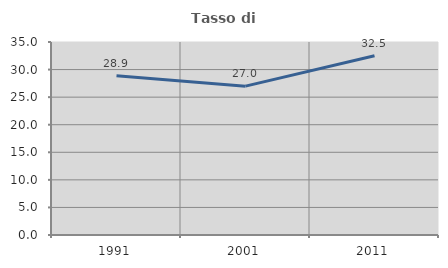
| Category | Tasso di occupazione   |
|---|---|
| 1991.0 | 28.86 |
| 2001.0 | 26.995 |
| 2011.0 | 32.519 |